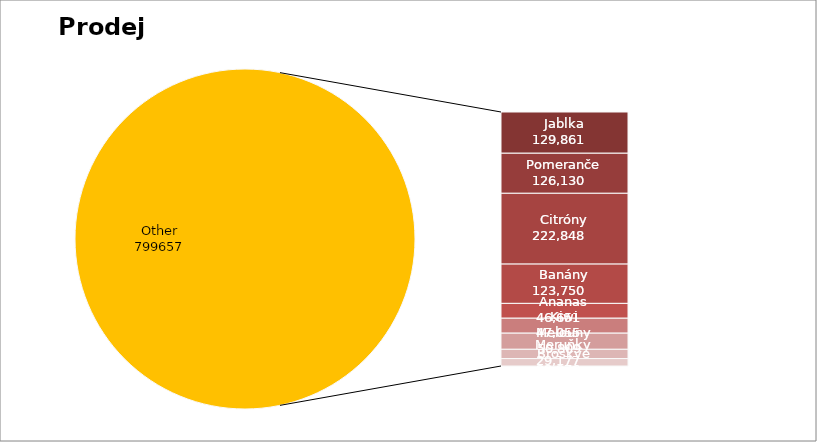
| Category | Series 0 |
|---|---|
| Jablka | 129861 |
| Pomeranče | 126130 |
| Citróny | 222848 |
| Banány | 123750 |
| Ananas | 46651 |
| Kiwi | 47055 |
| Melouny | 50809 |
| Meruňky | 29177 |
| Broskve | 23376 |